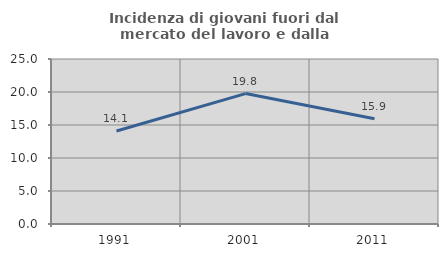
| Category | Incidenza di giovani fuori dal mercato del lavoro e dalla formazione  |
|---|---|
| 1991.0 | 14.084 |
| 2001.0 | 19.761 |
| 2011.0 | 15.946 |